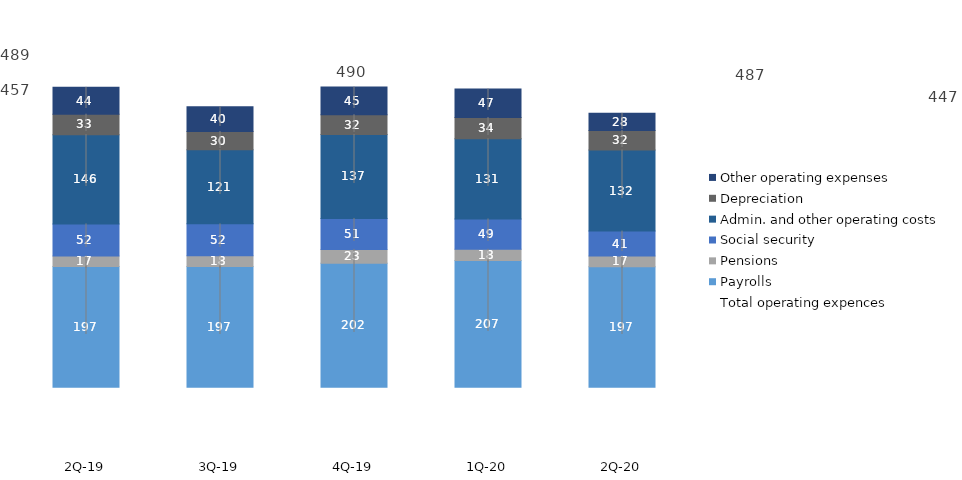
| Category | Payrolls | Pensions | Social security | Admin. and other operating costs | Depreciation | Other operating expenses |
|---|---|---|---|---|---|---|
| 2Q-20 | 196.66 | 17.386 | 40.656 | 132.408 | 31.771 | 27.996 |
| 1Q-20 | 206.729 | 18.337 | 49.424 | 130.978 | 34.5 | 46.562 |
| 4Q-19 | 202.122 | 22.717 | 50.527 | 137.063 | 32.223 | 45.052 |
| 3Q-19 | 197.115 | 17.531 | 51.896 | 120.883 | 29.827 | 40.201 |
| 2Q-19 | 196.87 | 17.26 | 52.39 | 145.58 | 33.35 | 43.87 |